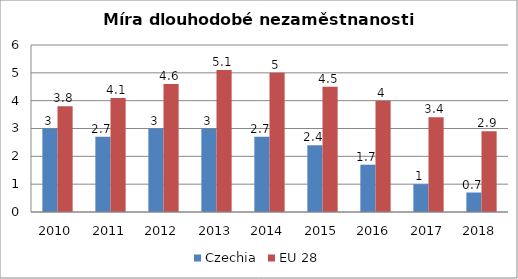
| Category | Czechia | EU 28 |
|---|---|---|
| 2010 | 3 | 3.8 |
| 2011 | 2.7 | 4.1 |
| 2012 | 3 | 4.6 |
| 2013 | 3 | 5.1 |
| 2014 | 2.7 | 5 |
| 2015 | 2.4 | 4.5 |
| 2016 | 1.7 | 4 |
| 2017 | 1 | 3.4 |
| 2018 | 0.7 | 2.9 |